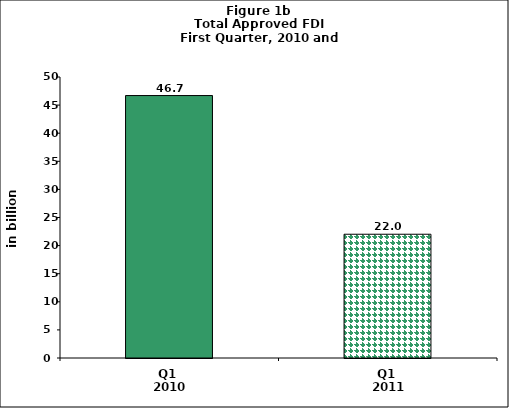
| Category | Series 0 |
|---|---|
| Q1 
2010 | 46.697 |
| Q1 
2011 | 22.022 |